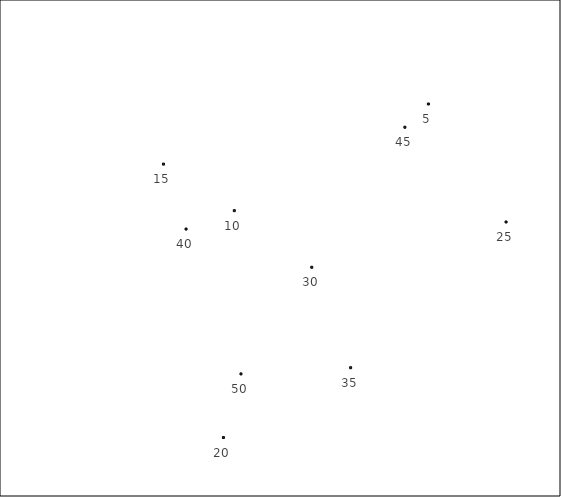
| Category | y |
|---|---|
| 0.7785172755387791 | 0.971 |
| 0.41301172822675347 | 0.697 |
| 0.27960131001936017 | 0.817 |
| 0.39249386098994477 | 0.114 |
| 0.9248020513047523 | 0.668 |
| 0.5588723909269908 | 0.552 |
| 0.6320869572542748 | 0.294 |
| 0.3221783971296508 | 0.65 |
| 0.7342373913366306 | 0.912 |
| 0.4255558306626871 | 0.278 |